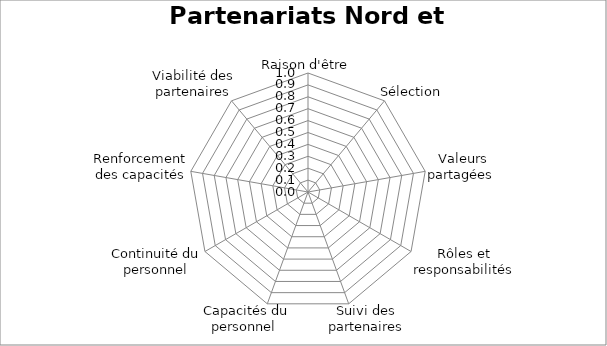
| Category | Series 0 |
|---|---|
| Raison d'être | 0 |
| Sélection | 0 |
| Valeurs partagées  | 0 |
| Rôles et responsabilités | 0 |
| Suivi des partenaires | 0 |
| Capacités du personnel  | 0 |
| Continuité du personnel | 0 |
| Renforcement des capacités | 0 |
| Viabilité des partenaires | 0 |